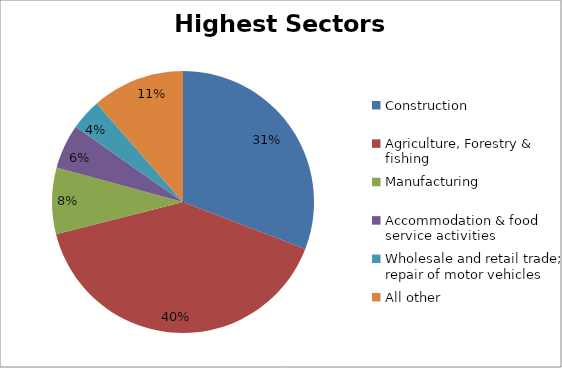
| Category | Sectors with highest totals | Percentage |
|---|---|---|
| Construction | 11025 | 0.308 |
| Agriculture, Forestry & fishing | 14366 | 0.402 |
| Manufacturing | 2934 | 0.082 |
| Accommodation & food service activities | 1961 | 0.055 |
| Wholesale and retail trade; repair of motor vehicles  | 1369 | 0.038 |
| All other | 4088 | 0.114 |